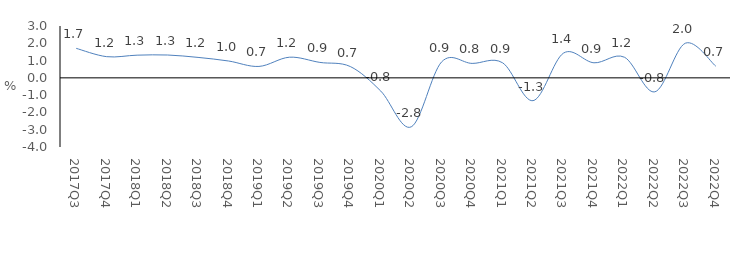
| Category | Series 0 |
|---|---|
| 2017Q3 | 1.707 |
| 2017Q4 | 1.226 |
| 2018Q1 | 1.313 |
| 2018Q2 | 1.322 |
| 2018Q3 | 1.184 |
| 2018Q4 | 0.976 |
| 2019Q1 | 0.661 |
| 2019Q2 | 1.194 |
| 2019Q3 | 0.894 |
| 2019Q4 | 0.655 |
| 2020Q1 | -0.765 |
| 2020Q2 | -2.835 |
| 2020Q3 | 0.928 |
| 2020Q4 | 0.835 |
| 2021Q1 | 0.872 |
| 2021Q2 | -1.32 |
| 2021Q3 | 1.432 |
| 2021Q4 | 0.872 |
| 2022Q1 | 1.195 |
| 2022Q2 | -0.808 |
| 2022Q3 | 2.004 |
| 2022Q4 | 0.676 |